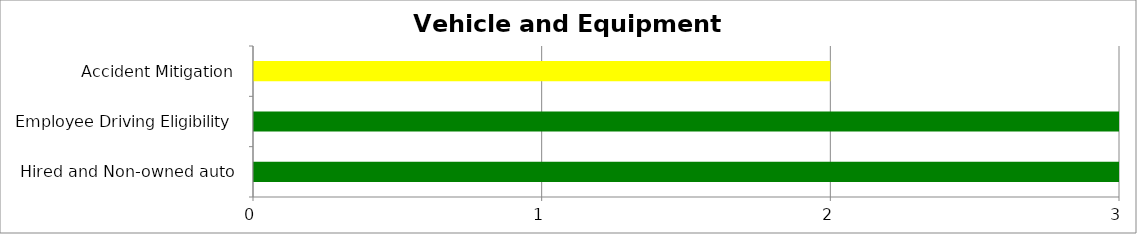
| Category | Low | Medium | High |
|---|---|---|---|
| Hired and Non-owned auto | 3 | 0 | 0 |
|  Employee Driving Eligibility | 3 | 0 | 0 |
| Accident Mitigation | 0 | 2 | 0 |